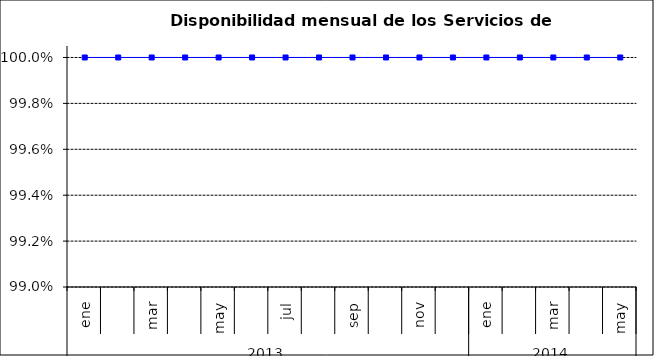
| Category | SCL |
|---|---|
| 0 | 1 |
| 1 | 1 |
| 2 | 1 |
| 3 | 1 |
| 4 | 1 |
| 5 | 1 |
| 6 | 1 |
| 7 | 1 |
| 8 | 1 |
| 9 | 1 |
| 10 | 1 |
| 11 | 1 |
| 12 | 1 |
| 13 | 1 |
| 14 | 1 |
| 15 | 1 |
| 16 | 1 |